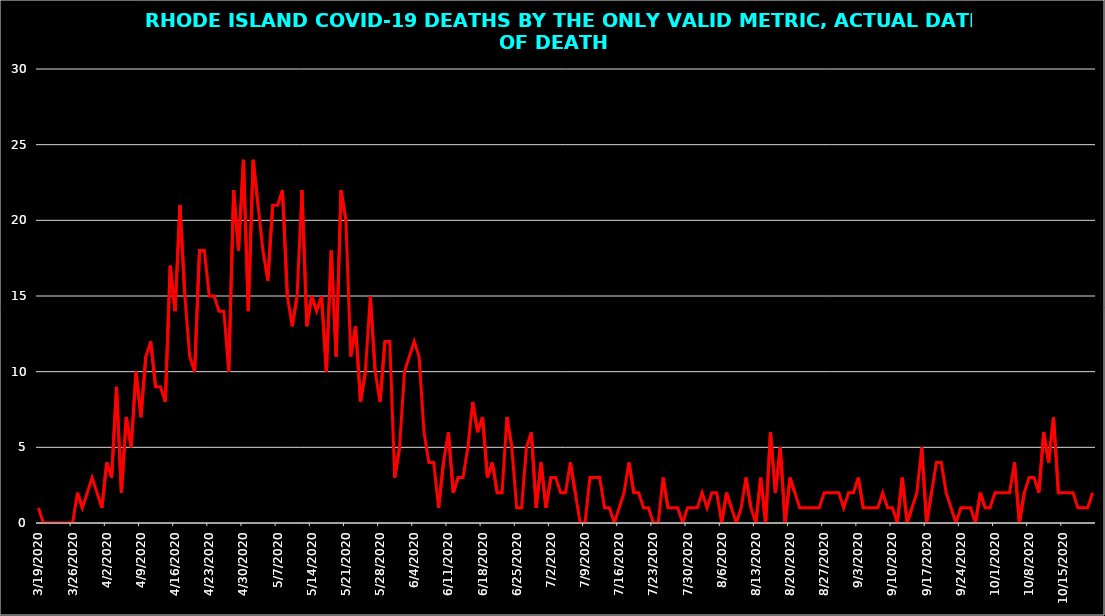
| Category | C19DTHS |
|---|---|
| 3/19/20 | 1 |
| 3/20/20 | 0 |
| 3/21/20 | 0 |
| 3/22/20 | 0 |
| 3/23/20 | 0 |
| 3/24/20 | 0 |
| 3/25/20 | 0 |
| 3/26/20 | 0 |
| 3/27/20 | 2 |
| 3/28/20 | 1 |
| 3/29/20 | 2 |
| 3/30/20 | 3 |
| 3/31/20 | 2 |
| 4/1/20 | 1 |
| 4/2/20 | 4 |
| 4/3/20 | 3 |
| 4/4/20 | 9 |
| 4/5/20 | 2 |
| 4/6/20 | 7 |
| 4/7/20 | 5 |
| 4/8/20 | 10 |
| 4/9/20 | 7 |
| 4/10/20 | 11 |
| 4/11/20 | 12 |
| 4/12/20 | 9 |
| 4/13/20 | 9 |
| 4/14/20 | 8 |
| 4/15/20 | 17 |
| 4/16/20 | 14 |
| 4/17/20 | 21 |
| 4/18/20 | 15 |
| 4/19/20 | 11 |
| 4/20/20 | 10 |
| 4/21/20 | 18 |
| 4/22/20 | 18 |
| 4/23/20 | 15 |
| 4/24/20 | 15 |
| 4/25/20 | 14 |
| 4/26/20 | 14 |
| 4/27/20 | 10 |
| 4/28/20 | 22 |
| 4/29/20 | 18 |
| 4/30/20 | 24 |
| 5/1/20 | 14 |
| 5/2/20 | 24 |
| 5/3/20 | 21 |
| 5/4/20 | 18 |
| 5/5/20 | 16 |
| 5/6/20 | 21 |
| 5/7/20 | 21 |
| 5/8/20 | 22 |
| 5/9/20 | 15 |
| 5/10/20 | 13 |
| 5/11/20 | 15 |
| 5/12/20 | 22 |
| 5/13/20 | 13 |
| 5/14/20 | 15 |
| 5/15/20 | 14 |
| 5/16/20 | 15 |
| 5/17/20 | 10 |
| 5/18/20 | 18 |
| 5/19/20 | 11 |
| 5/20/20 | 22 |
| 5/21/20 | 20 |
| 5/22/20 | 11 |
| 5/23/20 | 13 |
| 5/24/20 | 8 |
| 5/25/20 | 10 |
| 5/26/20 | 15 |
| 5/27/20 | 10 |
| 5/28/20 | 8 |
| 5/29/20 | 12 |
| 5/30/20 | 12 |
| 5/31/20 | 3 |
| 6/1/20 | 5 |
| 6/2/20 | 10 |
| 6/3/20 | 11 |
| 6/4/20 | 12 |
| 6/5/20 | 11 |
| 6/6/20 | 6 |
| 6/7/20 | 4 |
| 6/8/20 | 4 |
| 6/9/20 | 1 |
| 6/10/20 | 4 |
| 6/11/20 | 6 |
| 6/12/20 | 2 |
| 6/13/20 | 3 |
| 6/14/20 | 3 |
| 6/15/20 | 5 |
| 6/16/20 | 8 |
| 6/17/20 | 6 |
| 6/18/20 | 7 |
| 6/19/20 | 3 |
| 6/20/20 | 4 |
| 6/21/20 | 2 |
| 6/22/20 | 2 |
| 6/23/20 | 7 |
| 6/24/20 | 5 |
| 6/25/20 | 1 |
| 6/26/20 | 1 |
| 6/27/20 | 5 |
| 6/28/20 | 6 |
| 6/29/20 | 1 |
| 6/30/20 | 4 |
| 7/1/20 | 1 |
| 7/2/20 | 3 |
| 7/3/20 | 3 |
| 7/4/20 | 2 |
| 7/5/20 | 2 |
| 7/6/20 | 4 |
| 7/7/20 | 2 |
| 7/8/20 | 0 |
| 7/9/20 | 0 |
| 7/10/20 | 3 |
| 7/11/20 | 3 |
| 7/12/20 | 3 |
| 7/13/20 | 1 |
| 7/14/20 | 1 |
| 7/15/20 | 0 |
| 7/16/20 | 1 |
| 7/17/20 | 2 |
| 7/18/20 | 4 |
| 7/19/20 | 2 |
| 7/20/20 | 2 |
| 7/21/20 | 1 |
| 7/22/20 | 1 |
| 7/23/20 | 0 |
| 7/24/20 | 0 |
| 7/25/20 | 3 |
| 7/26/20 | 1 |
| 7/27/20 | 1 |
| 7/28/20 | 1 |
| 7/29/20 | 0 |
| 7/30/20 | 1 |
| 7/31/20 | 1 |
| 8/1/20 | 1 |
| 8/2/20 | 2 |
| 8/3/20 | 1 |
| 8/4/20 | 2 |
| 8/5/20 | 2 |
| 8/6/20 | 0 |
| 8/7/20 | 2 |
| 8/8/20 | 1 |
| 8/9/20 | 0 |
| 8/10/20 | 1 |
| 8/11/20 | 3 |
| 8/12/20 | 1 |
| 8/13/20 | 0 |
| 8/14/20 | 3 |
| 8/15/20 | 0 |
| 8/16/20 | 6 |
| 8/17/20 | 2 |
| 8/18/20 | 5 |
| 8/19/20 | 0 |
| 8/20/20 | 3 |
| 8/21/20 | 2 |
| 8/22/20 | 1 |
| 8/23/20 | 1 |
| 8/24/20 | 1 |
| 8/25/20 | 1 |
| 8/26/20 | 1 |
| 8/27/20 | 2 |
| 8/28/20 | 2 |
| 8/29/20 | 2 |
| 8/30/20 | 2 |
| 8/31/20 | 1 |
| 9/1/20 | 2 |
| 9/2/20 | 2 |
| 9/3/20 | 3 |
| 9/4/20 | 1 |
| 9/5/20 | 1 |
| 9/6/20 | 1 |
| 9/7/20 | 1 |
| 9/8/20 | 2 |
| 9/9/20 | 1 |
| 9/10/20 | 1 |
| 9/11/20 | 0 |
| 9/12/20 | 3 |
| 9/13/20 | 0 |
| 9/14/20 | 1 |
| 9/15/20 | 2 |
| 9/16/20 | 5 |
| 9/17/20 | 0 |
| 9/18/20 | 2 |
| 9/19/20 | 4 |
| 9/20/20 | 4 |
| 9/21/20 | 2 |
| 9/22/20 | 1 |
| 9/23/20 | 0 |
| 9/24/20 | 1 |
| 9/25/20 | 1 |
| 9/26/20 | 1 |
| 9/27/20 | 0 |
| 9/28/20 | 2 |
| 9/29/20 | 1 |
| 9/30/20 | 1 |
| 10/1/20 | 2 |
| 10/2/20 | 2 |
| 10/3/20 | 2 |
| 10/4/20 | 2 |
| 10/5/20 | 4 |
| 10/6/20 | 0 |
| 10/7/20 | 2 |
| 10/8/20 | 3 |
| 10/9/20 | 3 |
| 10/10/20 | 2 |
| 10/11/20 | 6 |
| 10/12/20 | 4 |
| 10/13/20 | 7 |
| 10/14/20 | 2 |
| 10/15/20 | 2 |
| 10/16/20 | 2 |
| 10/17/20 | 2 |
| 10/18/20 | 1 |
| 10/19/20 | 1 |
| 10/20/20 | 1 |
| 10/21/20 | 2 |